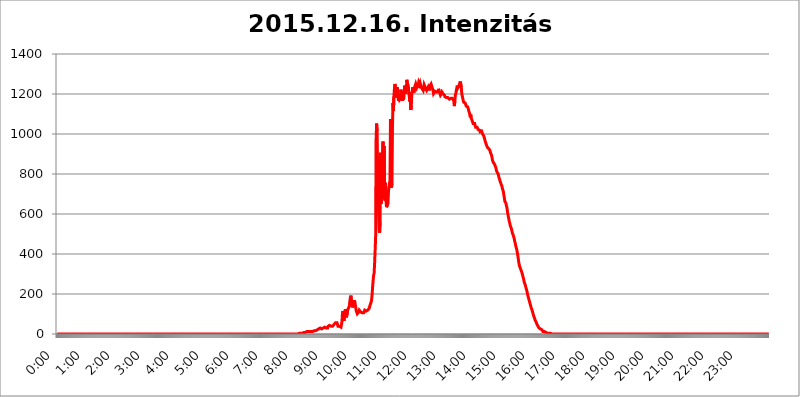
| Category | 2015.12.16. Intenzitás [W/m^2] |
|---|---|
| 0.0 | 0 |
| 0.0006944444444444445 | 0 |
| 0.001388888888888889 | 0 |
| 0.0020833333333333333 | 0 |
| 0.002777777777777778 | 0 |
| 0.003472222222222222 | 0 |
| 0.004166666666666667 | 0 |
| 0.004861111111111111 | 0 |
| 0.005555555555555556 | 0 |
| 0.0062499999999999995 | 0 |
| 0.006944444444444444 | 0 |
| 0.007638888888888889 | 0 |
| 0.008333333333333333 | 0 |
| 0.009027777777777779 | 0 |
| 0.009722222222222222 | 0 |
| 0.010416666666666666 | 0 |
| 0.011111111111111112 | 0 |
| 0.011805555555555555 | 0 |
| 0.012499999999999999 | 0 |
| 0.013194444444444444 | 0 |
| 0.013888888888888888 | 0 |
| 0.014583333333333332 | 0 |
| 0.015277777777777777 | 0 |
| 0.015972222222222224 | 0 |
| 0.016666666666666666 | 0 |
| 0.017361111111111112 | 0 |
| 0.018055555555555557 | 0 |
| 0.01875 | 0 |
| 0.019444444444444445 | 0 |
| 0.02013888888888889 | 0 |
| 0.020833333333333332 | 0 |
| 0.02152777777777778 | 0 |
| 0.022222222222222223 | 0 |
| 0.02291666666666667 | 0 |
| 0.02361111111111111 | 0 |
| 0.024305555555555556 | 0 |
| 0.024999999999999998 | 0 |
| 0.025694444444444447 | 0 |
| 0.02638888888888889 | 0 |
| 0.027083333333333334 | 0 |
| 0.027777777777777776 | 0 |
| 0.02847222222222222 | 0 |
| 0.029166666666666664 | 0 |
| 0.029861111111111113 | 0 |
| 0.030555555555555555 | 0 |
| 0.03125 | 0 |
| 0.03194444444444445 | 0 |
| 0.03263888888888889 | 0 |
| 0.03333333333333333 | 0 |
| 0.034027777777777775 | 0 |
| 0.034722222222222224 | 0 |
| 0.035416666666666666 | 0 |
| 0.036111111111111115 | 0 |
| 0.03680555555555556 | 0 |
| 0.0375 | 0 |
| 0.03819444444444444 | 0 |
| 0.03888888888888889 | 0 |
| 0.03958333333333333 | 0 |
| 0.04027777777777778 | 0 |
| 0.04097222222222222 | 0 |
| 0.041666666666666664 | 0 |
| 0.042361111111111106 | 0 |
| 0.04305555555555556 | 0 |
| 0.043750000000000004 | 0 |
| 0.044444444444444446 | 0 |
| 0.04513888888888889 | 0 |
| 0.04583333333333334 | 0 |
| 0.04652777777777778 | 0 |
| 0.04722222222222222 | 0 |
| 0.04791666666666666 | 0 |
| 0.04861111111111111 | 0 |
| 0.049305555555555554 | 0 |
| 0.049999999999999996 | 0 |
| 0.05069444444444445 | 0 |
| 0.051388888888888894 | 0 |
| 0.052083333333333336 | 0 |
| 0.05277777777777778 | 0 |
| 0.05347222222222222 | 0 |
| 0.05416666666666667 | 0 |
| 0.05486111111111111 | 0 |
| 0.05555555555555555 | 0 |
| 0.05625 | 0 |
| 0.05694444444444444 | 0 |
| 0.057638888888888885 | 0 |
| 0.05833333333333333 | 0 |
| 0.05902777777777778 | 0 |
| 0.059722222222222225 | 0 |
| 0.06041666666666667 | 0 |
| 0.061111111111111116 | 0 |
| 0.06180555555555556 | 0 |
| 0.0625 | 0 |
| 0.06319444444444444 | 0 |
| 0.06388888888888888 | 0 |
| 0.06458333333333334 | 0 |
| 0.06527777777777778 | 0 |
| 0.06597222222222222 | 0 |
| 0.06666666666666667 | 0 |
| 0.06736111111111111 | 0 |
| 0.06805555555555555 | 0 |
| 0.06874999999999999 | 0 |
| 0.06944444444444443 | 0 |
| 0.07013888888888889 | 0 |
| 0.07083333333333333 | 0 |
| 0.07152777777777779 | 0 |
| 0.07222222222222223 | 0 |
| 0.07291666666666667 | 0 |
| 0.07361111111111111 | 0 |
| 0.07430555555555556 | 0 |
| 0.075 | 0 |
| 0.07569444444444444 | 0 |
| 0.0763888888888889 | 0 |
| 0.07708333333333334 | 0 |
| 0.07777777777777778 | 0 |
| 0.07847222222222222 | 0 |
| 0.07916666666666666 | 0 |
| 0.0798611111111111 | 0 |
| 0.08055555555555556 | 0 |
| 0.08125 | 0 |
| 0.08194444444444444 | 0 |
| 0.08263888888888889 | 0 |
| 0.08333333333333333 | 0 |
| 0.08402777777777777 | 0 |
| 0.08472222222222221 | 0 |
| 0.08541666666666665 | 0 |
| 0.08611111111111112 | 0 |
| 0.08680555555555557 | 0 |
| 0.08750000000000001 | 0 |
| 0.08819444444444445 | 0 |
| 0.08888888888888889 | 0 |
| 0.08958333333333333 | 0 |
| 0.09027777777777778 | 0 |
| 0.09097222222222222 | 0 |
| 0.09166666666666667 | 0 |
| 0.09236111111111112 | 0 |
| 0.09305555555555556 | 0 |
| 0.09375 | 0 |
| 0.09444444444444444 | 0 |
| 0.09513888888888888 | 0 |
| 0.09583333333333333 | 0 |
| 0.09652777777777777 | 0 |
| 0.09722222222222222 | 0 |
| 0.09791666666666667 | 0 |
| 0.09861111111111111 | 0 |
| 0.09930555555555555 | 0 |
| 0.09999999999999999 | 0 |
| 0.10069444444444443 | 0 |
| 0.1013888888888889 | 0 |
| 0.10208333333333335 | 0 |
| 0.10277777777777779 | 0 |
| 0.10347222222222223 | 0 |
| 0.10416666666666667 | 0 |
| 0.10486111111111111 | 0 |
| 0.10555555555555556 | 0 |
| 0.10625 | 0 |
| 0.10694444444444444 | 0 |
| 0.1076388888888889 | 0 |
| 0.10833333333333334 | 0 |
| 0.10902777777777778 | 0 |
| 0.10972222222222222 | 0 |
| 0.1111111111111111 | 0 |
| 0.11180555555555556 | 0 |
| 0.11180555555555556 | 0 |
| 0.1125 | 0 |
| 0.11319444444444444 | 0 |
| 0.11388888888888889 | 0 |
| 0.11458333333333333 | 0 |
| 0.11527777777777777 | 0 |
| 0.11597222222222221 | 0 |
| 0.11666666666666665 | 0 |
| 0.1173611111111111 | 0 |
| 0.11805555555555557 | 0 |
| 0.11944444444444445 | 0 |
| 0.12013888888888889 | 0 |
| 0.12083333333333333 | 0 |
| 0.12152777777777778 | 0 |
| 0.12222222222222223 | 0 |
| 0.12291666666666667 | 0 |
| 0.12291666666666667 | 0 |
| 0.12361111111111112 | 0 |
| 0.12430555555555556 | 0 |
| 0.125 | 0 |
| 0.12569444444444444 | 0 |
| 0.12638888888888888 | 0 |
| 0.12708333333333333 | 0 |
| 0.16875 | 0 |
| 0.12847222222222224 | 0 |
| 0.12916666666666668 | 0 |
| 0.12986111111111112 | 0 |
| 0.13055555555555556 | 0 |
| 0.13125 | 0 |
| 0.13194444444444445 | 0 |
| 0.1326388888888889 | 0 |
| 0.13333333333333333 | 0 |
| 0.13402777777777777 | 0 |
| 0.13402777777777777 | 0 |
| 0.13472222222222222 | 0 |
| 0.13541666666666666 | 0 |
| 0.1361111111111111 | 0 |
| 0.13749999999999998 | 0 |
| 0.13819444444444443 | 0 |
| 0.1388888888888889 | 0 |
| 0.13958333333333334 | 0 |
| 0.14027777777777778 | 0 |
| 0.14097222222222222 | 0 |
| 0.14166666666666666 | 0 |
| 0.1423611111111111 | 0 |
| 0.14305555555555557 | 0 |
| 0.14375000000000002 | 0 |
| 0.14444444444444446 | 0 |
| 0.1451388888888889 | 0 |
| 0.1451388888888889 | 0 |
| 0.14652777777777778 | 0 |
| 0.14722222222222223 | 0 |
| 0.14791666666666667 | 0 |
| 0.1486111111111111 | 0 |
| 0.14930555555555555 | 0 |
| 0.15 | 0 |
| 0.15069444444444444 | 0 |
| 0.15138888888888888 | 0 |
| 0.15208333333333332 | 0 |
| 0.15277777777777776 | 0 |
| 0.15347222222222223 | 0 |
| 0.15416666666666667 | 0 |
| 0.15486111111111112 | 0 |
| 0.15555555555555556 | 0 |
| 0.15625 | 0 |
| 0.15694444444444444 | 0 |
| 0.15763888888888888 | 0 |
| 0.15833333333333333 | 0 |
| 0.15902777777777777 | 0 |
| 0.15972222222222224 | 0 |
| 0.16041666666666668 | 0 |
| 0.16111111111111112 | 0 |
| 0.16180555555555556 | 0 |
| 0.1625 | 0 |
| 0.16319444444444445 | 0 |
| 0.1638888888888889 | 0 |
| 0.16458333333333333 | 0 |
| 0.16527777777777777 | 0 |
| 0.16597222222222222 | 0 |
| 0.16666666666666666 | 0 |
| 0.1673611111111111 | 0 |
| 0.16805555555555554 | 0 |
| 0.16874999999999998 | 0 |
| 0.16944444444444443 | 0 |
| 0.17013888888888887 | 0 |
| 0.1708333333333333 | 0 |
| 0.17152777777777775 | 0 |
| 0.17222222222222225 | 0 |
| 0.1729166666666667 | 0 |
| 0.17361111111111113 | 0 |
| 0.17430555555555557 | 0 |
| 0.17500000000000002 | 0 |
| 0.17569444444444446 | 0 |
| 0.1763888888888889 | 0 |
| 0.17708333333333334 | 0 |
| 0.17777777777777778 | 0 |
| 0.17847222222222223 | 0 |
| 0.17916666666666667 | 0 |
| 0.1798611111111111 | 0 |
| 0.18055555555555555 | 0 |
| 0.18125 | 0 |
| 0.18194444444444444 | 0 |
| 0.1826388888888889 | 0 |
| 0.18333333333333335 | 0 |
| 0.1840277777777778 | 0 |
| 0.18472222222222223 | 0 |
| 0.18541666666666667 | 0 |
| 0.18611111111111112 | 0 |
| 0.18680555555555556 | 0 |
| 0.1875 | 0 |
| 0.18819444444444444 | 0 |
| 0.18888888888888888 | 0 |
| 0.18958333333333333 | 0 |
| 0.19027777777777777 | 0 |
| 0.1909722222222222 | 0 |
| 0.19166666666666665 | 0 |
| 0.19236111111111112 | 0 |
| 0.19305555555555554 | 0 |
| 0.19375 | 0 |
| 0.19444444444444445 | 0 |
| 0.1951388888888889 | 0 |
| 0.19583333333333333 | 0 |
| 0.19652777777777777 | 0 |
| 0.19722222222222222 | 0 |
| 0.19791666666666666 | 0 |
| 0.1986111111111111 | 0 |
| 0.19930555555555554 | 0 |
| 0.19999999999999998 | 0 |
| 0.20069444444444443 | 0 |
| 0.20138888888888887 | 0 |
| 0.2020833333333333 | 0 |
| 0.2027777777777778 | 0 |
| 0.2034722222222222 | 0 |
| 0.2041666666666667 | 0 |
| 0.20486111111111113 | 0 |
| 0.20555555555555557 | 0 |
| 0.20625000000000002 | 0 |
| 0.20694444444444446 | 0 |
| 0.2076388888888889 | 0 |
| 0.20833333333333334 | 0 |
| 0.20902777777777778 | 0 |
| 0.20972222222222223 | 0 |
| 0.21041666666666667 | 0 |
| 0.2111111111111111 | 0 |
| 0.21180555555555555 | 0 |
| 0.2125 | 0 |
| 0.21319444444444444 | 0 |
| 0.2138888888888889 | 0 |
| 0.21458333333333335 | 0 |
| 0.2152777777777778 | 0 |
| 0.21597222222222223 | 0 |
| 0.21666666666666667 | 0 |
| 0.21736111111111112 | 0 |
| 0.21805555555555556 | 0 |
| 0.21875 | 0 |
| 0.21944444444444444 | 0 |
| 0.22013888888888888 | 0 |
| 0.22083333333333333 | 0 |
| 0.22152777777777777 | 0 |
| 0.2222222222222222 | 0 |
| 0.22291666666666665 | 0 |
| 0.2236111111111111 | 0 |
| 0.22430555555555556 | 0 |
| 0.225 | 0 |
| 0.22569444444444445 | 0 |
| 0.2263888888888889 | 0 |
| 0.22708333333333333 | 0 |
| 0.22777777777777777 | 0 |
| 0.22847222222222222 | 0 |
| 0.22916666666666666 | 0 |
| 0.2298611111111111 | 0 |
| 0.23055555555555554 | 0 |
| 0.23124999999999998 | 0 |
| 0.23194444444444443 | 0 |
| 0.23263888888888887 | 0 |
| 0.2333333333333333 | 0 |
| 0.2340277777777778 | 0 |
| 0.2347222222222222 | 0 |
| 0.2354166666666667 | 0 |
| 0.23611111111111113 | 0 |
| 0.23680555555555557 | 0 |
| 0.23750000000000002 | 0 |
| 0.23819444444444446 | 0 |
| 0.2388888888888889 | 0 |
| 0.23958333333333334 | 0 |
| 0.24027777777777778 | 0 |
| 0.24097222222222223 | 0 |
| 0.24166666666666667 | 0 |
| 0.2423611111111111 | 0 |
| 0.24305555555555555 | 0 |
| 0.24375 | 0 |
| 0.24444444444444446 | 0 |
| 0.24513888888888888 | 0 |
| 0.24583333333333335 | 0 |
| 0.2465277777777778 | 0 |
| 0.24722222222222223 | 0 |
| 0.24791666666666667 | 0 |
| 0.24861111111111112 | 0 |
| 0.24930555555555556 | 0 |
| 0.25 | 0 |
| 0.25069444444444444 | 0 |
| 0.2513888888888889 | 0 |
| 0.2520833333333333 | 0 |
| 0.25277777777777777 | 0 |
| 0.2534722222222222 | 0 |
| 0.25416666666666665 | 0 |
| 0.2548611111111111 | 0 |
| 0.2555555555555556 | 0 |
| 0.25625000000000003 | 0 |
| 0.2569444444444445 | 0 |
| 0.2576388888888889 | 0 |
| 0.25833333333333336 | 0 |
| 0.2590277777777778 | 0 |
| 0.25972222222222224 | 0 |
| 0.2604166666666667 | 0 |
| 0.2611111111111111 | 0 |
| 0.26180555555555557 | 0 |
| 0.2625 | 0 |
| 0.26319444444444445 | 0 |
| 0.2638888888888889 | 0 |
| 0.26458333333333334 | 0 |
| 0.2652777777777778 | 0 |
| 0.2659722222222222 | 0 |
| 0.26666666666666666 | 0 |
| 0.2673611111111111 | 0 |
| 0.26805555555555555 | 0 |
| 0.26875 | 0 |
| 0.26944444444444443 | 0 |
| 0.2701388888888889 | 0 |
| 0.2708333333333333 | 0 |
| 0.27152777777777776 | 0 |
| 0.2722222222222222 | 0 |
| 0.27291666666666664 | 0 |
| 0.2736111111111111 | 0 |
| 0.2743055555555555 | 0 |
| 0.27499999999999997 | 0 |
| 0.27569444444444446 | 0 |
| 0.27638888888888885 | 0 |
| 0.27708333333333335 | 0 |
| 0.2777777777777778 | 0 |
| 0.27847222222222223 | 0 |
| 0.2791666666666667 | 0 |
| 0.2798611111111111 | 0 |
| 0.28055555555555556 | 0 |
| 0.28125 | 0 |
| 0.28194444444444444 | 0 |
| 0.2826388888888889 | 0 |
| 0.2833333333333333 | 0 |
| 0.28402777777777777 | 0 |
| 0.2847222222222222 | 0 |
| 0.28541666666666665 | 0 |
| 0.28611111111111115 | 0 |
| 0.28680555555555554 | 0 |
| 0.28750000000000003 | 0 |
| 0.2881944444444445 | 0 |
| 0.2888888888888889 | 0 |
| 0.28958333333333336 | 0 |
| 0.2902777777777778 | 0 |
| 0.29097222222222224 | 0 |
| 0.2916666666666667 | 0 |
| 0.2923611111111111 | 0 |
| 0.29305555555555557 | 0 |
| 0.29375 | 0 |
| 0.29444444444444445 | 0 |
| 0.2951388888888889 | 0 |
| 0.29583333333333334 | 0 |
| 0.2965277777777778 | 0 |
| 0.2972222222222222 | 0 |
| 0.29791666666666666 | 0 |
| 0.2986111111111111 | 0 |
| 0.29930555555555555 | 0 |
| 0.3 | 0 |
| 0.30069444444444443 | 0 |
| 0.3013888888888889 | 0 |
| 0.3020833333333333 | 0 |
| 0.30277777777777776 | 0 |
| 0.3034722222222222 | 0 |
| 0.30416666666666664 | 0 |
| 0.3048611111111111 | 0 |
| 0.3055555555555555 | 0 |
| 0.30624999999999997 | 0 |
| 0.3069444444444444 | 0 |
| 0.3076388888888889 | 0 |
| 0.30833333333333335 | 0 |
| 0.3090277777777778 | 0 |
| 0.30972222222222223 | 0 |
| 0.3104166666666667 | 0 |
| 0.3111111111111111 | 0 |
| 0.31180555555555556 | 0 |
| 0.3125 | 0 |
| 0.31319444444444444 | 0 |
| 0.3138888888888889 | 0 |
| 0.3145833333333333 | 0 |
| 0.31527777777777777 | 0 |
| 0.3159722222222222 | 0 |
| 0.31666666666666665 | 0 |
| 0.31736111111111115 | 0 |
| 0.31805555555555554 | 0 |
| 0.31875000000000003 | 0 |
| 0.3194444444444445 | 0 |
| 0.3201388888888889 | 0 |
| 0.32083333333333336 | 0 |
| 0.3215277777777778 | 0 |
| 0.32222222222222224 | 0 |
| 0.3229166666666667 | 0 |
| 0.3236111111111111 | 0 |
| 0.32430555555555557 | 0 |
| 0.325 | 0 |
| 0.32569444444444445 | 0 |
| 0.3263888888888889 | 0 |
| 0.32708333333333334 | 0 |
| 0.3277777777777778 | 0 |
| 0.3284722222222222 | 0 |
| 0.32916666666666666 | 0 |
| 0.3298611111111111 | 0 |
| 0.33055555555555555 | 0 |
| 0.33125 | 0 |
| 0.33194444444444443 | 0 |
| 0.3326388888888889 | 0 |
| 0.3333333333333333 | 0 |
| 0.3340277777777778 | 0 |
| 0.3347222222222222 | 0 |
| 0.3354166666666667 | 0 |
| 0.3361111111111111 | 0 |
| 0.3368055555555556 | 0 |
| 0.33749999999999997 | 0 |
| 0.33819444444444446 | 0 |
| 0.33888888888888885 | 3.525 |
| 0.33958333333333335 | 3.525 |
| 0.34027777777777773 | 3.525 |
| 0.34097222222222223 | 3.525 |
| 0.3416666666666666 | 3.525 |
| 0.3423611111111111 | 3.525 |
| 0.3430555555555555 | 3.525 |
| 0.34375 | 3.525 |
| 0.3444444444444445 | 3.525 |
| 0.3451388888888889 | 3.525 |
| 0.3458333333333334 | 7.887 |
| 0.34652777777777777 | 7.887 |
| 0.34722222222222227 | 7.887 |
| 0.34791666666666665 | 7.887 |
| 0.34861111111111115 | 7.887 |
| 0.34930555555555554 | 7.887 |
| 0.35000000000000003 | 12.257 |
| 0.3506944444444444 | 12.257 |
| 0.3513888888888889 | 12.257 |
| 0.3520833333333333 | 12.257 |
| 0.3527777777777778 | 12.257 |
| 0.3534722222222222 | 12.257 |
| 0.3541666666666667 | 12.257 |
| 0.3548611111111111 | 12.257 |
| 0.35555555555555557 | 12.257 |
| 0.35625 | 12.257 |
| 0.35694444444444445 | 12.257 |
| 0.3576388888888889 | 12.257 |
| 0.35833333333333334 | 12.257 |
| 0.3590277777777778 | 12.257 |
| 0.3597222222222222 | 16.636 |
| 0.36041666666666666 | 16.636 |
| 0.3611111111111111 | 16.636 |
| 0.36180555555555555 | 16.636 |
| 0.3625 | 16.636 |
| 0.36319444444444443 | 21.024 |
| 0.3638888888888889 | 21.024 |
| 0.3645833333333333 | 21.024 |
| 0.3652777777777778 | 21.024 |
| 0.3659722222222222 | 25.419 |
| 0.3666666666666667 | 25.419 |
| 0.3673611111111111 | 29.823 |
| 0.3680555555555556 | 29.823 |
| 0.36874999999999997 | 29.823 |
| 0.36944444444444446 | 29.823 |
| 0.37013888888888885 | 25.419 |
| 0.37083333333333335 | 25.419 |
| 0.37152777777777773 | 25.419 |
| 0.37222222222222223 | 25.419 |
| 0.3729166666666666 | 29.823 |
| 0.3736111111111111 | 29.823 |
| 0.3743055555555555 | 34.234 |
| 0.375 | 34.234 |
| 0.3756944444444445 | 34.234 |
| 0.3763888888888889 | 29.823 |
| 0.3770833333333334 | 29.823 |
| 0.37777777777777777 | 29.823 |
| 0.37847222222222227 | 29.823 |
| 0.37916666666666665 | 29.823 |
| 0.37986111111111115 | 38.653 |
| 0.38055555555555554 | 38.653 |
| 0.38125000000000003 | 43.079 |
| 0.3819444444444444 | 43.079 |
| 0.3826388888888889 | 43.079 |
| 0.3833333333333333 | 38.653 |
| 0.3840277777777778 | 38.653 |
| 0.3847222222222222 | 38.653 |
| 0.3854166666666667 | 38.653 |
| 0.3861111111111111 | 38.653 |
| 0.38680555555555557 | 43.079 |
| 0.3875 | 43.079 |
| 0.38819444444444445 | 47.511 |
| 0.3888888888888889 | 51.951 |
| 0.38958333333333334 | 51.951 |
| 0.3902777777777778 | 56.398 |
| 0.3909722222222222 | 51.951 |
| 0.39166666666666666 | 56.398 |
| 0.3923611111111111 | 56.398 |
| 0.39305555555555555 | 47.511 |
| 0.39375 | 38.653 |
| 0.39444444444444443 | 43.079 |
| 0.3951388888888889 | 43.079 |
| 0.3958333333333333 | 38.653 |
| 0.3965277777777778 | 38.653 |
| 0.3972222222222222 | 34.234 |
| 0.3979166666666667 | 34.234 |
| 0.3986111111111111 | 38.653 |
| 0.3993055555555556 | 60.85 |
| 0.39999999999999997 | 101.184 |
| 0.40069444444444446 | 114.716 |
| 0.40138888888888885 | 105.69 |
| 0.40208333333333335 | 65.31 |
| 0.40277777777777773 | 87.692 |
| 0.40347222222222223 | 114.716 |
| 0.4041666666666666 | 123.758 |
| 0.4048611111111111 | 96.682 |
| 0.4055555555555555 | 83.205 |
| 0.40625 | 87.692 |
| 0.4069444444444445 | 110.201 |
| 0.4076388888888889 | 123.758 |
| 0.4083333333333334 | 128.284 |
| 0.40902777777777777 | 132.814 |
| 0.40972222222222227 | 141.884 |
| 0.41041666666666665 | 164.605 |
| 0.41111111111111115 | 182.82 |
| 0.41180555555555554 | 191.937 |
| 0.41250000000000003 | 173.709 |
| 0.4131944444444444 | 146.423 |
| 0.4138888888888889 | 132.814 |
| 0.4145833333333333 | 132.814 |
| 0.4152777777777778 | 137.347 |
| 0.4159722222222222 | 155.509 |
| 0.4166666666666667 | 169.156 |
| 0.4173611111111111 | 160.056 |
| 0.41805555555555557 | 146.423 |
| 0.41875 | 128.284 |
| 0.41944444444444445 | 114.716 |
| 0.4201388888888889 | 110.201 |
| 0.42083333333333334 | 101.184 |
| 0.4215277777777778 | 101.184 |
| 0.4222222222222222 | 105.69 |
| 0.42291666666666666 | 110.201 |
| 0.4236111111111111 | 119.235 |
| 0.42430555555555555 | 123.758 |
| 0.425 | 119.235 |
| 0.42569444444444443 | 110.201 |
| 0.4263888888888889 | 105.69 |
| 0.4270833333333333 | 105.69 |
| 0.4277777777777778 | 105.69 |
| 0.4284722222222222 | 101.184 |
| 0.4291666666666667 | 101.184 |
| 0.4298611111111111 | 105.69 |
| 0.4305555555555556 | 110.201 |
| 0.43124999999999997 | 119.235 |
| 0.43194444444444446 | 119.235 |
| 0.43263888888888885 | 119.235 |
| 0.43333333333333335 | 114.716 |
| 0.43402777777777773 | 114.716 |
| 0.43472222222222223 | 114.716 |
| 0.4354166666666666 | 119.235 |
| 0.4361111111111111 | 119.235 |
| 0.4368055555555555 | 123.758 |
| 0.4375 | 128.284 |
| 0.4381944444444445 | 137.347 |
| 0.4388888888888889 | 146.423 |
| 0.4395833333333334 | 150.964 |
| 0.44027777777777777 | 160.056 |
| 0.44097222222222227 | 173.709 |
| 0.44166666666666665 | 201.058 |
| 0.44236111111111115 | 237.564 |
| 0.44305555555555554 | 269.49 |
| 0.44375000000000003 | 292.259 |
| 0.4444444444444444 | 305.898 |
| 0.4451388888888889 | 355.712 |
| 0.4458333333333333 | 418.492 |
| 0.4465277777777778 | 480.356 |
| 0.4472222222222222 | 973.772 |
| 0.4479166666666667 | 1052.255 |
| 0.4486111111111111 | 1014.852 |
| 0.44930555555555557 | 841.526 |
| 0.45 | 723.889 |
| 0.45069444444444445 | 604.864 |
| 0.4513888888888889 | 519.555 |
| 0.45208333333333334 | 506.542 |
| 0.4527777777777778 | 562.53 |
| 0.4534722222222222 | 906.223 |
| 0.45416666666666666 | 650.667 |
| 0.4548611111111111 | 687.544 |
| 0.45555555555555555 | 771.559 |
| 0.45625 | 906.223 |
| 0.45694444444444443 | 962.555 |
| 0.4576388888888889 | 675.311 |
| 0.4583333333333333 | 940.082 |
| 0.4590277777777778 | 747.834 |
| 0.4597222222222222 | 667.123 |
| 0.4604166666666667 | 755.766 |
| 0.4611111111111111 | 667.123 |
| 0.4618055555555556 | 634.105 |
| 0.46249999999999997 | 634.105 |
| 0.46319444444444446 | 634.105 |
| 0.46388888888888885 | 654.791 |
| 0.46458333333333335 | 715.858 |
| 0.46527777777777773 | 731.896 |
| 0.46597222222222223 | 755.766 |
| 0.4666666666666666 | 763.674 |
| 0.4673611111111111 | 1074.789 |
| 0.4680555555555555 | 775.492 |
| 0.46875 | 731.896 |
| 0.4694444444444445 | 751.803 |
| 0.4701388888888889 | 1026.06 |
| 0.4708333333333334 | 1154.814 |
| 0.47152777777777777 | 1116.426 |
| 0.47222222222222227 | 1189.969 |
| 0.47291666666666665 | 1225.859 |
| 0.47361111111111115 | 1250.275 |
| 0.47430555555555554 | 1233.951 |
| 0.47500000000000003 | 1182.099 |
| 0.4756944444444444 | 1193.918 |
| 0.4763888888888889 | 1205.82 |
| 0.4770833333333333 | 1233.951 |
| 0.4777777777777778 | 1193.918 |
| 0.4784722222222222 | 1166.46 |
| 0.4791666666666667 | 1178.177 |
| 0.4798611111111111 | 1170.358 |
| 0.48055555555555557 | 1170.358 |
| 0.48125 | 1178.177 |
| 0.48194444444444445 | 1221.83 |
| 0.4826388888888889 | 1205.82 |
| 0.48333333333333334 | 1213.804 |
| 0.4840277777777778 | 1166.46 |
| 0.4847222222222222 | 1182.099 |
| 0.48541666666666666 | 1170.358 |
| 0.4861111111111111 | 1182.099 |
| 0.48680555555555555 | 1217.812 |
| 0.4875 | 1242.089 |
| 0.48819444444444443 | 1201.843 |
| 0.4888888888888889 | 1197.876 |
| 0.4895833333333333 | 1213.804 |
| 0.4902777777777778 | 1270.964 |
| 0.4909722222222222 | 1254.387 |
| 0.4916666666666667 | 1258.511 |
| 0.4923611111111111 | 1242.089 |
| 0.4930555555555556 | 1201.843 |
| 0.49374999999999997 | 1189.969 |
| 0.49444444444444446 | 1162.571 |
| 0.49513888888888885 | 1209.807 |
| 0.49583333333333335 | 1120.238 |
| 0.49652777777777773 | 1139.384 |
| 0.49722222222222223 | 1197.876 |
| 0.4979166666666666 | 1213.804 |
| 0.4986111111111111 | 1233.951 |
| 0.4993055555555555 | 1233.951 |
| 0.5 | 1205.82 |
| 0.5006944444444444 | 1201.843 |
| 0.5013888888888889 | 1205.82 |
| 0.5020833333333333 | 1242.089 |
| 0.5027777777777778 | 1250.275 |
| 0.5034722222222222 | 1246.176 |
| 0.5041666666666667 | 1233.951 |
| 0.5048611111111111 | 1242.089 |
| 0.5055555555555555 | 1229.899 |
| 0.50625 | 1246.176 |
| 0.5069444444444444 | 1258.511 |
| 0.5076388888888889 | 1258.511 |
| 0.5083333333333333 | 1246.176 |
| 0.5090277777777777 | 1254.387 |
| 0.5097222222222222 | 1250.275 |
| 0.5104166666666666 | 1233.951 |
| 0.5111111111111112 | 1233.951 |
| 0.5118055555555555 | 1225.859 |
| 0.5125000000000001 | 1229.899 |
| 0.5131944444444444 | 1217.812 |
| 0.513888888888889 | 1229.899 |
| 0.5145833333333333 | 1246.176 |
| 0.5152777777777778 | 1242.089 |
| 0.5159722222222222 | 1233.951 |
| 0.5166666666666667 | 1225.859 |
| 0.517361111111111 | 1221.83 |
| 0.5180555555555556 | 1217.812 |
| 0.5187499999999999 | 1217.812 |
| 0.5194444444444445 | 1217.812 |
| 0.5201388888888888 | 1233.951 |
| 0.5208333333333334 | 1225.859 |
| 0.5215277777777778 | 1217.812 |
| 0.5222222222222223 | 1221.83 |
| 0.5229166666666667 | 1242.089 |
| 0.5236111111111111 | 1246.176 |
| 0.5243055555555556 | 1250.275 |
| 0.525 | 1242.089 |
| 0.5256944444444445 | 1242.089 |
| 0.5263888888888889 | 1238.014 |
| 0.5270833333333333 | 1217.812 |
| 0.5277777777777778 | 1201.843 |
| 0.5284722222222222 | 1201.843 |
| 0.5291666666666667 | 1205.82 |
| 0.5298611111111111 | 1213.804 |
| 0.5305555555555556 | 1209.807 |
| 0.53125 | 1209.807 |
| 0.5319444444444444 | 1209.807 |
| 0.5326388888888889 | 1205.82 |
| 0.5333333333333333 | 1205.82 |
| 0.5340277777777778 | 1209.807 |
| 0.5347222222222222 | 1225.859 |
| 0.5354166666666667 | 1217.812 |
| 0.5361111111111111 | 1209.807 |
| 0.5368055555555555 | 1201.843 |
| 0.5375 | 1193.918 |
| 0.5381944444444444 | 1193.918 |
| 0.5388888888888889 | 1201.843 |
| 0.5395833333333333 | 1209.807 |
| 0.5402777777777777 | 1205.82 |
| 0.5409722222222222 | 1201.843 |
| 0.5416666666666666 | 1205.82 |
| 0.5423611111111112 | 1201.843 |
| 0.5430555555555555 | 1193.918 |
| 0.5437500000000001 | 1186.03 |
| 0.5444444444444444 | 1189.969 |
| 0.545138888888889 | 1189.969 |
| 0.5458333333333333 | 1182.099 |
| 0.5465277777777778 | 1186.03 |
| 0.5472222222222222 | 1186.03 |
| 0.5479166666666667 | 1182.099 |
| 0.548611111111111 | 1178.177 |
| 0.5493055555555556 | 1178.177 |
| 0.5499999999999999 | 1174.263 |
| 0.5506944444444445 | 1174.263 |
| 0.5513888888888888 | 1178.177 |
| 0.5520833333333334 | 1178.177 |
| 0.5527777777777778 | 1174.263 |
| 0.5534722222222223 | 1174.263 |
| 0.5541666666666667 | 1178.177 |
| 0.5548611111111111 | 1178.177 |
| 0.5555555555555556 | 1170.358 |
| 0.55625 | 1162.571 |
| 0.5569444444444445 | 1139.384 |
| 0.5576388888888889 | 1166.46 |
| 0.5583333333333333 | 1193.918 |
| 0.5590277777777778 | 1201.843 |
| 0.5597222222222222 | 1217.812 |
| 0.5604166666666667 | 1229.899 |
| 0.5611111111111111 | 1242.089 |
| 0.5618055555555556 | 1229.899 |
| 0.5625 | 1233.951 |
| 0.5631944444444444 | 1238.014 |
| 0.5638888888888889 | 1246.176 |
| 0.5645833333333333 | 1242.089 |
| 0.5652777777777778 | 1262.649 |
| 0.5659722222222222 | 1258.511 |
| 0.5666666666666667 | 1233.951 |
| 0.5673611111111111 | 1201.843 |
| 0.5680555555555555 | 1189.969 |
| 0.56875 | 1178.177 |
| 0.5694444444444444 | 1166.46 |
| 0.5701388888888889 | 1158.689 |
| 0.5708333333333333 | 1154.814 |
| 0.5715277777777777 | 1162.571 |
| 0.5722222222222222 | 1154.814 |
| 0.5729166666666666 | 1147.086 |
| 0.5736111111111112 | 1139.384 |
| 0.5743055555555555 | 1135.543 |
| 0.5750000000000001 | 1135.543 |
| 0.5756944444444444 | 1135.543 |
| 0.576388888888889 | 1127.879 |
| 0.5770833333333333 | 1116.426 |
| 0.5777777777777778 | 1108.816 |
| 0.5784722222222222 | 1101.226 |
| 0.5791666666666667 | 1086.097 |
| 0.579861111111111 | 1097.437 |
| 0.5805555555555556 | 1078.555 |
| 0.5812499999999999 | 1074.789 |
| 0.5819444444444445 | 1067.267 |
| 0.5826388888888888 | 1067.267 |
| 0.5833333333333334 | 1052.255 |
| 0.5840277777777778 | 1056.004 |
| 0.5847222222222223 | 1052.255 |
| 0.5854166666666667 | 1052.255 |
| 0.5861111111111111 | 1048.508 |
| 0.5868055555555556 | 1033.537 |
| 0.5875 | 1037.277 |
| 0.5881944444444445 | 1037.277 |
| 0.5888888888888889 | 1033.537 |
| 0.5895833333333333 | 1029.798 |
| 0.5902777777777778 | 1022.323 |
| 0.5909722222222222 | 1022.323 |
| 0.5916666666666667 | 1026.06 |
| 0.5923611111111111 | 1018.587 |
| 0.5930555555555556 | 1011.118 |
| 0.59375 | 1011.118 |
| 0.5944444444444444 | 1014.852 |
| 0.5951388888888889 | 1014.852 |
| 0.5958333333333333 | 1007.383 |
| 0.5965277777777778 | 999.916 |
| 0.5972222222222222 | 996.182 |
| 0.5979166666666667 | 992.448 |
| 0.5986111111111111 | 984.98 |
| 0.5993055555555555 | 977.508 |
| 0.6 | 966.295 |
| 0.6006944444444444 | 958.814 |
| 0.6013888888888889 | 951.327 |
| 0.6020833333333333 | 943.832 |
| 0.6027777777777777 | 940.082 |
| 0.6034722222222222 | 932.576 |
| 0.6041666666666666 | 932.576 |
| 0.6048611111111112 | 928.819 |
| 0.6055555555555555 | 925.06 |
| 0.6062500000000001 | 925.06 |
| 0.6069444444444444 | 917.534 |
| 0.607638888888889 | 906.223 |
| 0.6083333333333333 | 902.447 |
| 0.6090277777777778 | 894.885 |
| 0.6097222222222222 | 883.516 |
| 0.6104166666666667 | 868.305 |
| 0.611111111111111 | 864.493 |
| 0.6118055555555556 | 856.855 |
| 0.6124999999999999 | 853.029 |
| 0.6131944444444445 | 849.199 |
| 0.6138888888888888 | 845.365 |
| 0.6145833333333334 | 837.682 |
| 0.6152777777777778 | 829.981 |
| 0.6159722222222223 | 818.392 |
| 0.6166666666666667 | 810.641 |
| 0.6173611111111111 | 806.757 |
| 0.6180555555555556 | 802.868 |
| 0.61875 | 795.074 |
| 0.6194444444444445 | 783.342 |
| 0.6201388888888889 | 775.492 |
| 0.6208333333333333 | 767.62 |
| 0.6215277777777778 | 759.723 |
| 0.6222222222222222 | 751.803 |
| 0.6229166666666667 | 747.834 |
| 0.6236111111111111 | 739.877 |
| 0.6243055555555556 | 727.896 |
| 0.625 | 723.889 |
| 0.6256944444444444 | 711.832 |
| 0.6263888888888889 | 695.666 |
| 0.6270833333333333 | 679.395 |
| 0.6277777777777778 | 663.019 |
| 0.6284722222222222 | 658.909 |
| 0.6291666666666667 | 654.791 |
| 0.6298611111111111 | 642.4 |
| 0.6305555555555555 | 634.105 |
| 0.63125 | 617.436 |
| 0.6319444444444444 | 600.661 |
| 0.6326388888888889 | 588.009 |
| 0.6333333333333333 | 575.299 |
| 0.6340277777777777 | 562.53 |
| 0.6347222222222222 | 553.986 |
| 0.6354166666666666 | 541.121 |
| 0.6361111111111112 | 536.82 |
| 0.6368055555555555 | 528.2 |
| 0.6375000000000001 | 519.555 |
| 0.6381944444444444 | 506.542 |
| 0.638888888888889 | 502.192 |
| 0.6395833333333333 | 493.475 |
| 0.6402777777777778 | 484.735 |
| 0.6409722222222222 | 475.972 |
| 0.6416666666666667 | 462.786 |
| 0.642361111111111 | 453.968 |
| 0.6430555555555556 | 440.702 |
| 0.6437499999999999 | 431.833 |
| 0.6444444444444445 | 422.943 |
| 0.6451388888888888 | 409.574 |
| 0.6458333333333334 | 396.164 |
| 0.6465277777777778 | 378.224 |
| 0.6472222222222223 | 360.221 |
| 0.6479166666666667 | 346.682 |
| 0.6486111111111111 | 337.639 |
| 0.6493055555555556 | 333.113 |
| 0.65 | 324.052 |
| 0.6506944444444445 | 319.517 |
| 0.6513888888888889 | 310.44 |
| 0.6520833333333333 | 301.354 |
| 0.6527777777777778 | 292.259 |
| 0.6534722222222222 | 283.156 |
| 0.6541666666666667 | 274.047 |
| 0.6548611111111111 | 260.373 |
| 0.6555555555555556 | 255.813 |
| 0.65625 | 246.689 |
| 0.6569444444444444 | 237.564 |
| 0.6576388888888889 | 228.436 |
| 0.6583333333333333 | 219.309 |
| 0.6590277777777778 | 210.182 |
| 0.6597222222222222 | 196.497 |
| 0.6604166666666667 | 187.378 |
| 0.6611111111111111 | 178.264 |
| 0.6618055555555555 | 169.156 |
| 0.6625 | 160.056 |
| 0.6631944444444444 | 150.964 |
| 0.6638888888888889 | 141.884 |
| 0.6645833333333333 | 132.814 |
| 0.6652777777777777 | 128.284 |
| 0.6659722222222222 | 119.235 |
| 0.6666666666666666 | 110.201 |
| 0.6673611111111111 | 101.184 |
| 0.6680555555555556 | 92.184 |
| 0.6687500000000001 | 87.692 |
| 0.6694444444444444 | 78.722 |
| 0.6701388888888888 | 69.775 |
| 0.6708333333333334 | 65.31 |
| 0.6715277777777778 | 60.85 |
| 0.6722222222222222 | 56.398 |
| 0.6729166666666666 | 47.511 |
| 0.6736111111111112 | 47.511 |
| 0.6743055555555556 | 38.653 |
| 0.6749999999999999 | 34.234 |
| 0.6756944444444444 | 29.823 |
| 0.6763888888888889 | 29.823 |
| 0.6770833333333334 | 25.419 |
| 0.6777777777777777 | 25.419 |
| 0.6784722222222223 | 21.024 |
| 0.6791666666666667 | 21.024 |
| 0.6798611111111111 | 21.024 |
| 0.6805555555555555 | 16.636 |
| 0.68125 | 12.257 |
| 0.6819444444444445 | 12.257 |
| 0.6826388888888889 | 12.257 |
| 0.6833333333333332 | 12.257 |
| 0.6840277777777778 | 7.887 |
| 0.6847222222222222 | 7.887 |
| 0.6854166666666667 | 7.887 |
| 0.686111111111111 | 7.887 |
| 0.6868055555555556 | 3.525 |
| 0.6875 | 3.525 |
| 0.6881944444444444 | 3.525 |
| 0.688888888888889 | 3.525 |
| 0.6895833333333333 | 3.525 |
| 0.6902777777777778 | 3.525 |
| 0.6909722222222222 | 3.525 |
| 0.6916666666666668 | 3.525 |
| 0.6923611111111111 | 3.525 |
| 0.6930555555555555 | 0 |
| 0.69375 | 0 |
| 0.6944444444444445 | 0 |
| 0.6951388888888889 | 0 |
| 0.6958333333333333 | 0 |
| 0.6965277777777777 | 0 |
| 0.6972222222222223 | 0 |
| 0.6979166666666666 | 0 |
| 0.6986111111111111 | 0 |
| 0.6993055555555556 | 0 |
| 0.7000000000000001 | 0 |
| 0.7006944444444444 | 0 |
| 0.7013888888888888 | 0 |
| 0.7020833333333334 | 0 |
| 0.7027777777777778 | 0 |
| 0.7034722222222222 | 0 |
| 0.7041666666666666 | 0 |
| 0.7048611111111112 | 0 |
| 0.7055555555555556 | 0 |
| 0.7062499999999999 | 0 |
| 0.7069444444444444 | 0 |
| 0.7076388888888889 | 0 |
| 0.7083333333333334 | 0 |
| 0.7090277777777777 | 0 |
| 0.7097222222222223 | 0 |
| 0.7104166666666667 | 0 |
| 0.7111111111111111 | 0 |
| 0.7118055555555555 | 0 |
| 0.7125 | 0 |
| 0.7131944444444445 | 0 |
| 0.7138888888888889 | 0 |
| 0.7145833333333332 | 0 |
| 0.7152777777777778 | 0 |
| 0.7159722222222222 | 0 |
| 0.7166666666666667 | 0 |
| 0.717361111111111 | 0 |
| 0.7180555555555556 | 0 |
| 0.71875 | 0 |
| 0.7194444444444444 | 0 |
| 0.720138888888889 | 0 |
| 0.7208333333333333 | 0 |
| 0.7215277777777778 | 0 |
| 0.7222222222222222 | 0 |
| 0.7229166666666668 | 0 |
| 0.7236111111111111 | 0 |
| 0.7243055555555555 | 0 |
| 0.725 | 0 |
| 0.7256944444444445 | 0 |
| 0.7263888888888889 | 0 |
| 0.7270833333333333 | 0 |
| 0.7277777777777777 | 0 |
| 0.7284722222222223 | 0 |
| 0.7291666666666666 | 0 |
| 0.7298611111111111 | 0 |
| 0.7305555555555556 | 0 |
| 0.7312500000000001 | 0 |
| 0.7319444444444444 | 0 |
| 0.7326388888888888 | 0 |
| 0.7333333333333334 | 0 |
| 0.7340277777777778 | 0 |
| 0.7347222222222222 | 0 |
| 0.7354166666666666 | 0 |
| 0.7361111111111112 | 0 |
| 0.7368055555555556 | 0 |
| 0.7374999999999999 | 0 |
| 0.7381944444444444 | 0 |
| 0.7388888888888889 | 0 |
| 0.7395833333333334 | 0 |
| 0.7402777777777777 | 0 |
| 0.7409722222222223 | 0 |
| 0.7416666666666667 | 0 |
| 0.7423611111111111 | 0 |
| 0.7430555555555555 | 0 |
| 0.74375 | 0 |
| 0.7444444444444445 | 0 |
| 0.7451388888888889 | 0 |
| 0.7458333333333332 | 0 |
| 0.7465277777777778 | 0 |
| 0.7472222222222222 | 0 |
| 0.7479166666666667 | 0 |
| 0.748611111111111 | 0 |
| 0.7493055555555556 | 0 |
| 0.75 | 0 |
| 0.7506944444444444 | 0 |
| 0.751388888888889 | 0 |
| 0.7520833333333333 | 0 |
| 0.7527777777777778 | 0 |
| 0.7534722222222222 | 0 |
| 0.7541666666666668 | 0 |
| 0.7548611111111111 | 0 |
| 0.7555555555555555 | 0 |
| 0.75625 | 0 |
| 0.7569444444444445 | 0 |
| 0.7576388888888889 | 0 |
| 0.7583333333333333 | 0 |
| 0.7590277777777777 | 0 |
| 0.7597222222222223 | 0 |
| 0.7604166666666666 | 0 |
| 0.7611111111111111 | 0 |
| 0.7618055555555556 | 0 |
| 0.7625000000000001 | 0 |
| 0.7631944444444444 | 0 |
| 0.7638888888888888 | 0 |
| 0.7645833333333334 | 0 |
| 0.7652777777777778 | 0 |
| 0.7659722222222222 | 0 |
| 0.7666666666666666 | 0 |
| 0.7673611111111112 | 0 |
| 0.7680555555555556 | 0 |
| 0.7687499999999999 | 0 |
| 0.7694444444444444 | 0 |
| 0.7701388888888889 | 0 |
| 0.7708333333333334 | 0 |
| 0.7715277777777777 | 0 |
| 0.7722222222222223 | 0 |
| 0.7729166666666667 | 0 |
| 0.7736111111111111 | 0 |
| 0.7743055555555555 | 0 |
| 0.775 | 0 |
| 0.7756944444444445 | 0 |
| 0.7763888888888889 | 0 |
| 0.7770833333333332 | 0 |
| 0.7777777777777778 | 0 |
| 0.7784722222222222 | 0 |
| 0.7791666666666667 | 0 |
| 0.779861111111111 | 0 |
| 0.7805555555555556 | 0 |
| 0.78125 | 0 |
| 0.7819444444444444 | 0 |
| 0.782638888888889 | 0 |
| 0.7833333333333333 | 0 |
| 0.7840277777777778 | 0 |
| 0.7847222222222222 | 0 |
| 0.7854166666666668 | 0 |
| 0.7861111111111111 | 0 |
| 0.7868055555555555 | 0 |
| 0.7875 | 0 |
| 0.7881944444444445 | 0 |
| 0.7888888888888889 | 0 |
| 0.7895833333333333 | 0 |
| 0.7902777777777777 | 0 |
| 0.7909722222222223 | 0 |
| 0.7916666666666666 | 0 |
| 0.7923611111111111 | 0 |
| 0.7930555555555556 | 0 |
| 0.7937500000000001 | 0 |
| 0.7944444444444444 | 0 |
| 0.7951388888888888 | 0 |
| 0.7958333333333334 | 0 |
| 0.7965277777777778 | 0 |
| 0.7972222222222222 | 0 |
| 0.7979166666666666 | 0 |
| 0.7986111111111112 | 0 |
| 0.7993055555555556 | 0 |
| 0.7999999999999999 | 0 |
| 0.8006944444444444 | 0 |
| 0.8013888888888889 | 0 |
| 0.8020833333333334 | 0 |
| 0.8027777777777777 | 0 |
| 0.8034722222222223 | 0 |
| 0.8041666666666667 | 0 |
| 0.8048611111111111 | 0 |
| 0.8055555555555555 | 0 |
| 0.80625 | 0 |
| 0.8069444444444445 | 0 |
| 0.8076388888888889 | 0 |
| 0.8083333333333332 | 0 |
| 0.8090277777777778 | 0 |
| 0.8097222222222222 | 0 |
| 0.8104166666666667 | 0 |
| 0.811111111111111 | 0 |
| 0.8118055555555556 | 0 |
| 0.8125 | 0 |
| 0.8131944444444444 | 0 |
| 0.813888888888889 | 0 |
| 0.8145833333333333 | 0 |
| 0.8152777777777778 | 0 |
| 0.8159722222222222 | 0 |
| 0.8166666666666668 | 0 |
| 0.8173611111111111 | 0 |
| 0.8180555555555555 | 0 |
| 0.81875 | 0 |
| 0.8194444444444445 | 0 |
| 0.8201388888888889 | 0 |
| 0.8208333333333333 | 0 |
| 0.8215277777777777 | 0 |
| 0.8222222222222223 | 0 |
| 0.8229166666666666 | 0 |
| 0.8236111111111111 | 0 |
| 0.8243055555555556 | 0 |
| 0.8250000000000001 | 0 |
| 0.8256944444444444 | 0 |
| 0.8263888888888888 | 0 |
| 0.8270833333333334 | 0 |
| 0.8277777777777778 | 0 |
| 0.8284722222222222 | 0 |
| 0.8291666666666666 | 0 |
| 0.8298611111111112 | 0 |
| 0.8305555555555556 | 0 |
| 0.8312499999999999 | 0 |
| 0.8319444444444444 | 0 |
| 0.8326388888888889 | 0 |
| 0.8333333333333334 | 0 |
| 0.8340277777777777 | 0 |
| 0.8347222222222223 | 0 |
| 0.8354166666666667 | 0 |
| 0.8361111111111111 | 0 |
| 0.8368055555555555 | 0 |
| 0.8375 | 0 |
| 0.8381944444444445 | 0 |
| 0.8388888888888889 | 0 |
| 0.8395833333333332 | 0 |
| 0.8402777777777778 | 0 |
| 0.8409722222222222 | 0 |
| 0.8416666666666667 | 0 |
| 0.842361111111111 | 0 |
| 0.8430555555555556 | 0 |
| 0.84375 | 0 |
| 0.8444444444444444 | 0 |
| 0.845138888888889 | 0 |
| 0.8458333333333333 | 0 |
| 0.8465277777777778 | 0 |
| 0.8472222222222222 | 0 |
| 0.8479166666666668 | 0 |
| 0.8486111111111111 | 0 |
| 0.8493055555555555 | 0 |
| 0.85 | 0 |
| 0.8506944444444445 | 0 |
| 0.8513888888888889 | 0 |
| 0.8520833333333333 | 0 |
| 0.8527777777777777 | 0 |
| 0.8534722222222223 | 0 |
| 0.8541666666666666 | 0 |
| 0.8548611111111111 | 0 |
| 0.8555555555555556 | 0 |
| 0.8562500000000001 | 0 |
| 0.8569444444444444 | 0 |
| 0.8576388888888888 | 0 |
| 0.8583333333333334 | 0 |
| 0.8590277777777778 | 0 |
| 0.8597222222222222 | 0 |
| 0.8604166666666666 | 0 |
| 0.8611111111111112 | 0 |
| 0.8618055555555556 | 0 |
| 0.8624999999999999 | 0 |
| 0.8631944444444444 | 0 |
| 0.8638888888888889 | 0 |
| 0.8645833333333334 | 0 |
| 0.8652777777777777 | 0 |
| 0.8659722222222223 | 0 |
| 0.8666666666666667 | 0 |
| 0.8673611111111111 | 0 |
| 0.8680555555555555 | 0 |
| 0.86875 | 0 |
| 0.8694444444444445 | 0 |
| 0.8701388888888889 | 0 |
| 0.8708333333333332 | 0 |
| 0.8715277777777778 | 0 |
| 0.8722222222222222 | 0 |
| 0.8729166666666667 | 0 |
| 0.873611111111111 | 0 |
| 0.8743055555555556 | 0 |
| 0.875 | 0 |
| 0.8756944444444444 | 0 |
| 0.876388888888889 | 0 |
| 0.8770833333333333 | 0 |
| 0.8777777777777778 | 0 |
| 0.8784722222222222 | 0 |
| 0.8791666666666668 | 0 |
| 0.8798611111111111 | 0 |
| 0.8805555555555555 | 0 |
| 0.88125 | 0 |
| 0.8819444444444445 | 0 |
| 0.8826388888888889 | 0 |
| 0.8833333333333333 | 0 |
| 0.8840277777777777 | 0 |
| 0.8847222222222223 | 0 |
| 0.8854166666666666 | 0 |
| 0.8861111111111111 | 0 |
| 0.8868055555555556 | 0 |
| 0.8875000000000001 | 0 |
| 0.8881944444444444 | 0 |
| 0.8888888888888888 | 0 |
| 0.8895833333333334 | 0 |
| 0.8902777777777778 | 0 |
| 0.8909722222222222 | 0 |
| 0.8916666666666666 | 0 |
| 0.8923611111111112 | 0 |
| 0.8930555555555556 | 0 |
| 0.8937499999999999 | 0 |
| 0.8944444444444444 | 0 |
| 0.8951388888888889 | 0 |
| 0.8958333333333334 | 0 |
| 0.8965277777777777 | 0 |
| 0.8972222222222223 | 0 |
| 0.8979166666666667 | 0 |
| 0.8986111111111111 | 0 |
| 0.8993055555555555 | 0 |
| 0.9 | 0 |
| 0.9006944444444445 | 0 |
| 0.9013888888888889 | 0 |
| 0.9020833333333332 | 0 |
| 0.9027777777777778 | 0 |
| 0.9034722222222222 | 0 |
| 0.9041666666666667 | 0 |
| 0.904861111111111 | 0 |
| 0.9055555555555556 | 0 |
| 0.90625 | 0 |
| 0.9069444444444444 | 0 |
| 0.907638888888889 | 0 |
| 0.9083333333333333 | 0 |
| 0.9090277777777778 | 0 |
| 0.9097222222222222 | 0 |
| 0.9104166666666668 | 0 |
| 0.9111111111111111 | 0 |
| 0.9118055555555555 | 0 |
| 0.9125 | 0 |
| 0.9131944444444445 | 0 |
| 0.9138888888888889 | 0 |
| 0.9145833333333333 | 0 |
| 0.9152777777777777 | 0 |
| 0.9159722222222223 | 0 |
| 0.9166666666666666 | 0 |
| 0.9173611111111111 | 0 |
| 0.9180555555555556 | 0 |
| 0.9187500000000001 | 0 |
| 0.9194444444444444 | 0 |
| 0.9201388888888888 | 0 |
| 0.9208333333333334 | 0 |
| 0.9215277777777778 | 0 |
| 0.9222222222222222 | 0 |
| 0.9229166666666666 | 0 |
| 0.9236111111111112 | 0 |
| 0.9243055555555556 | 0 |
| 0.9249999999999999 | 0 |
| 0.9256944444444444 | 0 |
| 0.9263888888888889 | 0 |
| 0.9270833333333334 | 0 |
| 0.9277777777777777 | 0 |
| 0.9284722222222223 | 0 |
| 0.9291666666666667 | 0 |
| 0.9298611111111111 | 0 |
| 0.9305555555555555 | 0 |
| 0.93125 | 0 |
| 0.9319444444444445 | 0 |
| 0.9326388888888889 | 0 |
| 0.9333333333333332 | 0 |
| 0.9340277777777778 | 0 |
| 0.9347222222222222 | 0 |
| 0.9354166666666667 | 0 |
| 0.936111111111111 | 0 |
| 0.9368055555555556 | 0 |
| 0.9375 | 0 |
| 0.9381944444444444 | 0 |
| 0.938888888888889 | 0 |
| 0.9395833333333333 | 0 |
| 0.9402777777777778 | 0 |
| 0.9409722222222222 | 0 |
| 0.9416666666666668 | 0 |
| 0.9423611111111111 | 0 |
| 0.9430555555555555 | 0 |
| 0.94375 | 0 |
| 0.9444444444444445 | 0 |
| 0.9451388888888889 | 0 |
| 0.9458333333333333 | 0 |
| 0.9465277777777777 | 0 |
| 0.9472222222222223 | 0 |
| 0.9479166666666666 | 0 |
| 0.9486111111111111 | 0 |
| 0.9493055555555556 | 0 |
| 0.9500000000000001 | 0 |
| 0.9506944444444444 | 0 |
| 0.9513888888888888 | 0 |
| 0.9520833333333334 | 0 |
| 0.9527777777777778 | 0 |
| 0.9534722222222222 | 0 |
| 0.9541666666666666 | 0 |
| 0.9548611111111112 | 0 |
| 0.9555555555555556 | 0 |
| 0.9562499999999999 | 0 |
| 0.9569444444444444 | 0 |
| 0.9576388888888889 | 0 |
| 0.9583333333333334 | 0 |
| 0.9590277777777777 | 0 |
| 0.9597222222222223 | 0 |
| 0.9604166666666667 | 0 |
| 0.9611111111111111 | 0 |
| 0.9618055555555555 | 0 |
| 0.9625 | 0 |
| 0.9631944444444445 | 0 |
| 0.9638888888888889 | 0 |
| 0.9645833333333332 | 0 |
| 0.9652777777777778 | 0 |
| 0.9659722222222222 | 0 |
| 0.9666666666666667 | 0 |
| 0.967361111111111 | 0 |
| 0.9680555555555556 | 0 |
| 0.96875 | 0 |
| 0.9694444444444444 | 0 |
| 0.970138888888889 | 0 |
| 0.9708333333333333 | 0 |
| 0.9715277777777778 | 0 |
| 0.9722222222222222 | 0 |
| 0.9729166666666668 | 0 |
| 0.9736111111111111 | 0 |
| 0.9743055555555555 | 0 |
| 0.975 | 0 |
| 0.9756944444444445 | 0 |
| 0.9763888888888889 | 0 |
| 0.9770833333333333 | 0 |
| 0.9777777777777777 | 0 |
| 0.9784722222222223 | 0 |
| 0.9791666666666666 | 0 |
| 0.9798611111111111 | 0 |
| 0.9805555555555556 | 0 |
| 0.9812500000000001 | 0 |
| 0.9819444444444444 | 0 |
| 0.9826388888888888 | 0 |
| 0.9833333333333334 | 0 |
| 0.9840277777777778 | 0 |
| 0.9847222222222222 | 0 |
| 0.9854166666666666 | 0 |
| 0.9861111111111112 | 0 |
| 0.9868055555555556 | 0 |
| 0.9874999999999999 | 0 |
| 0.9881944444444444 | 0 |
| 0.9888888888888889 | 0 |
| 0.9895833333333334 | 0 |
| 0.9902777777777777 | 0 |
| 0.9909722222222223 | 0 |
| 0.9916666666666667 | 0 |
| 0.9923611111111111 | 0 |
| 0.9930555555555555 | 0 |
| 0.99375 | 0 |
| 0.9944444444444445 | 0 |
| 0.9951388888888889 | 0 |
| 0.9958333333333332 | 0 |
| 0.9965277777777778 | 0 |
| 0.9972222222222222 | 0 |
| 0.9979166666666667 | 0 |
| 0.998611111111111 | 0 |
| 0.9993055555555556 | 0 |